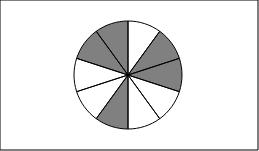
| Category | Series 0 | Series 1 |
|---|---|---|
| 0 | 1 |  |
| 1 | 1 |  |
| 2 | 1 |  |
| 3 | 1 |  |
| 4 | 1 |  |
| 5 | 1 |  |
| 6 | 1 |  |
| 7 | 1 |  |
| 8 | 1 |  |
| 9 | 1 |  |